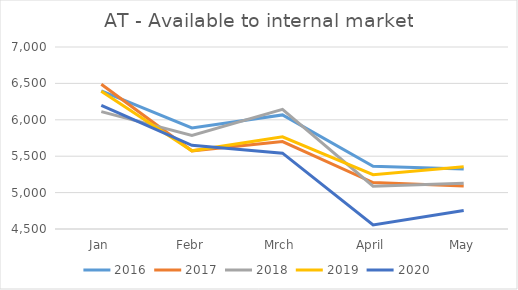
| Category | 2016 | 2017 | 2018 | 2019 | 2020 |
|---|---|---|---|---|---|
| Jan | 6397 | 6487.446 | 6112.774 | 6392.332 | 6198.976 |
| Febr | 5888 | 5573.772 | 5784.098 | 5573.692 | 5649.613 |
| Mrch | 6067 | 5701.377 | 6142.653 | 5765.677 | 5541.86 |
| April | 5361 | 5137.276 | 5088.123 | 5245.656 | 4555.8 |
| May | 5324 | 5091.377 | 5128.399 | 5355.76 | 4754.406 |